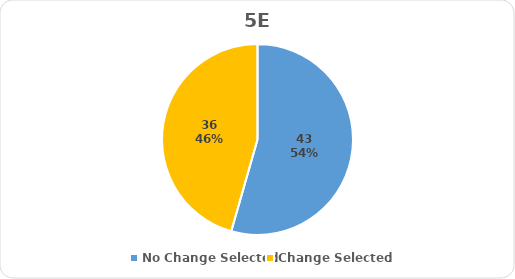
| Category | Series 0 |
|---|---|
| No Change Selected | 43 |
| Change Selected | 36 |